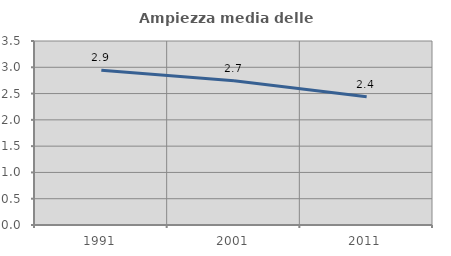
| Category | Ampiezza media delle famiglie |
|---|---|
| 1991.0 | 2.944 |
| 2001.0 | 2.746 |
| 2011.0 | 2.441 |